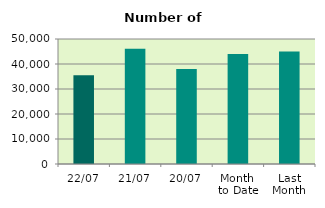
| Category | Series 0 |
|---|---|
| 22/07 | 35536 |
| 21/07 | 46066 |
| 20/07 | 38018 |
| Month 
to Date | 44030.375 |
| Last
Month | 45009.909 |